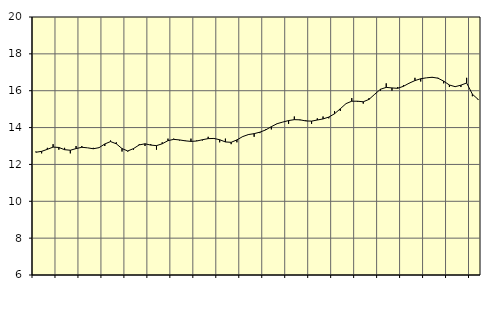
| Category | Piggar | Utbildning, SNI 85 |
|---|---|---|
| nan | 12.7 | 12.66 |
| 1.0 | 12.6 | 12.71 |
| 1.0 | 12.9 | 12.82 |
| 1.0 | 13.1 | 12.94 |
| nan | 12.8 | 12.92 |
| 2.0 | 12.9 | 12.8 |
| 2.0 | 12.6 | 12.77 |
| 2.0 | 13 | 12.86 |
| nan | 13 | 12.93 |
| 3.0 | 12.9 | 12.9 |
| 3.0 | 12.9 | 12.85 |
| 3.0 | 12.9 | 12.91 |
| nan | 13 | 13.11 |
| 4.0 | 13.3 | 13.24 |
| 4.0 | 13.2 | 13.12 |
| 4.0 | 12.7 | 12.86 |
| nan | 12.7 | 12.73 |
| 5.0 | 12.8 | 12.86 |
| 5.0 | 13.1 | 13.06 |
| 5.0 | 13 | 13.12 |
| nan | 13.1 | 13.05 |
| 6.0 | 12.8 | 13.02 |
| 6.0 | 13.2 | 13.12 |
| 6.0 | 13.4 | 13.29 |
| nan | 13.4 | 13.36 |
| 7.0 | 13.3 | 13.33 |
| 7.0 | 13.3 | 13.28 |
| 7.0 | 13.4 | 13.25 |
| nan | 13.3 | 13.27 |
| 8.0 | 13.3 | 13.34 |
| 8.0 | 13.5 | 13.4 |
| 8.0 | 13.4 | 13.41 |
| nan | 13.2 | 13.34 |
| 9.0 | 13.4 | 13.22 |
| 9.0 | 13.1 | 13.2 |
| 9.0 | 13.2 | 13.33 |
| nan | 13.5 | 13.51 |
| 10.0 | 13.6 | 13.62 |
| 10.0 | 13.5 | 13.67 |
| 10.0 | 13.7 | 13.75 |
| nan | 13.9 | 13.87 |
| 11.0 | 13.9 | 14.05 |
| 11.0 | 14.2 | 14.21 |
| 11.0 | 14.3 | 14.3 |
| nan | 14.2 | 14.38 |
| 12.0 | 14.6 | 14.43 |
| 12.0 | 14.4 | 14.42 |
| 12.0 | 14.4 | 14.36 |
| nan | 14.2 | 14.35 |
| 13.0 | 14.5 | 14.41 |
| 13.0 | 14.6 | 14.47 |
| 13.0 | 14.5 | 14.57 |
| nan | 14.9 | 14.75 |
| 14.0 | 14.9 | 15.02 |
| 14.0 | 15.3 | 15.3 |
| 14.0 | 15.6 | 15.43 |
| nan | 15.4 | 15.43 |
| 15.0 | 15.3 | 15.4 |
| 15.0 | 15.6 | 15.53 |
| 15.0 | 15.8 | 15.81 |
| nan | 16 | 16.08 |
| 16.0 | 16.4 | 16.18 |
| 16.0 | 16 | 16.15 |
| 16.0 | 16.2 | 16.13 |
| nan | 16.3 | 16.24 |
| 17.0 | 16.4 | 16.41 |
| 17.0 | 16.7 | 16.55 |
| 17.0 | 16.5 | 16.65 |
| nan | 16.7 | 16.7 |
| 18.0 | 16.7 | 16.73 |
| 18.0 | 16.7 | 16.68 |
| 18.0 | 16.4 | 16.52 |
| nan | 16.2 | 16.31 |
| 19.0 | 16.2 | 16.22 |
| 19.0 | 16.2 | 16.3 |
| 19.0 | 16.7 | 16.42 |
| nan | 15.7 | 15.81 |
| 20.0 | 15.5 | 15.53 |